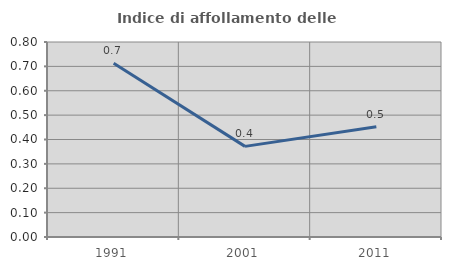
| Category | Indice di affollamento delle abitazioni  |
|---|---|
| 1991.0 | 0.713 |
| 2001.0 | 0.372 |
| 2011.0 | 0.452 |